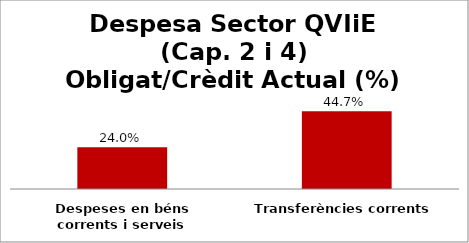
| Category | Series 0 |
|---|---|
| Despeses en béns corrents i serveis | 0.24 |
| Transferències corrents | 0.447 |